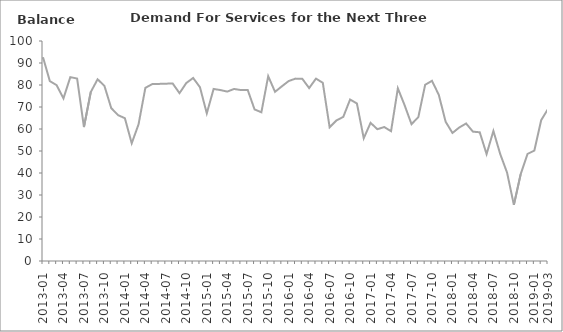
| Category | Balance |
|---|---|
| 2013-01 | 92.6 |
|  | 81.8 |
|  | 79.9 |
| 2013-04 | 73.9 |
|  | 83.6 |
|  | 82.9 |
| 2013-07 | 60.9 |
|  | 76.8 |
|  | 82.6 |
| 2013-10 | 79.6 |
|  | 69.5 |
|  | 66.3 |
| 2014-01 | 64.9 |
|  | 53.5 |
|  | 62.1 |
| 2014-04 | 78.7 |
|  | 80.4 |
|  | 80.5 |
| 2014-07 | 80.6 |
|  | 80.7 |
|  | 76.3 |
| 2014-10 | 80.9 |
|  | 83.2 |
|  | 79 |
| 2015-01 | 67.1 |
|  | 78.2 |
|  | 77.7 |
| 2015-04 | 77 |
|  | 78.2 |
|  | 77.7 |
| 2015-07 | 77.7 |
|  | 68.9 |
|  | 67.6 |
| 2015-10 | 84 |
|  | 76.9 |
|  | 79.4 |
| 2016-01 | 81.8 |
|  | 82.9 |
|  | 82.8 |
| 2016-04 | 78.6 |
|  | 82.9 |
|  | 81 |
| 2016-07 | 60.8 |
|  | 63.9 |
|  | 65.5 |
| 2016-10 | 73.4 |
|  | 71.6 |
|  | 55.8 |
| 2017-01 | 62.8 |
|  | 59.9 |
|  | 60.9 |
| 2017-04 | 59 |
|  | 78.5 |
|  | 70.7 |
| 2017-07 | 62.2 |
|  | 65.4 |
|  | 80.1 |
| 2017-10 | 81.9 |
|  | 75.5 |
|  | 63.3 |
| 2018-01 | 58.2 |
|  | 60.7 |
|  | 62.5 |
| 2018-04 | 58.8 |
|  | 58.5 |
|  | 48.6 |
| 2018-07 | 59.1 |
|  | 48.6 |
|  | 40.2 |
| 2018-10 | 25.5 |
|  | 39.5 |
|  | 48.7 |
| 2019-01 | 50.2 |
|  | 64 |
| 2019-03 | 69.1 |